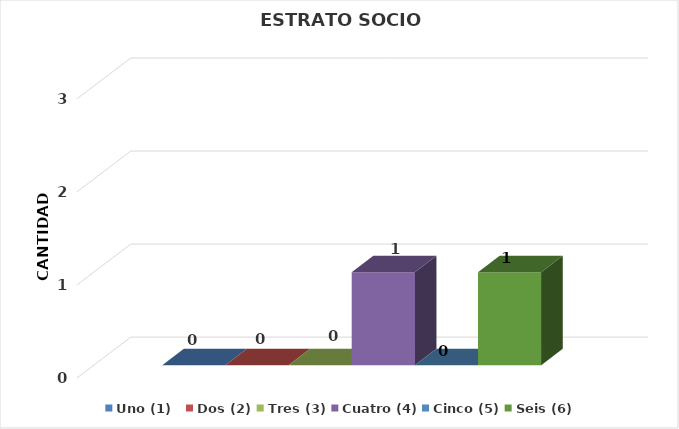
| Category | Uno (1)   | Dos (2) | Tres (3) | Cuatro (4) | Cinco (5) | Seis (6) |
|---|---|---|---|---|---|---|
| 0 | 0 | 0 | 0 | 1 | 0 | 1 |